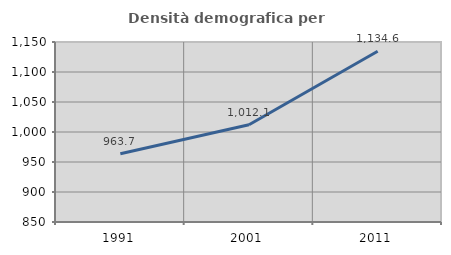
| Category | Densità demografica |
|---|---|
| 1991.0 | 963.719 |
| 2001.0 | 1012.087 |
| 2011.0 | 1134.646 |